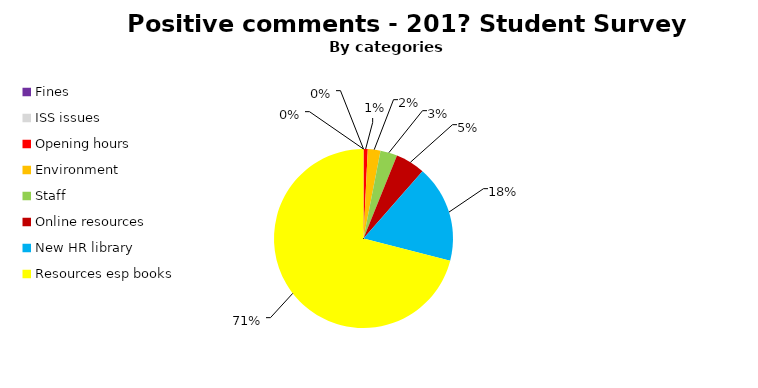
| Category | Series 0 |
|---|---|
| Fines  | 0 |
| ISS issues | 0 |
| Opening hours | 1 |
| Environment  | 3 |
| Staff  | 4 |
| Online resources  | 7 |
| New HR library | 23 |
| Resources esp books  | 93 |